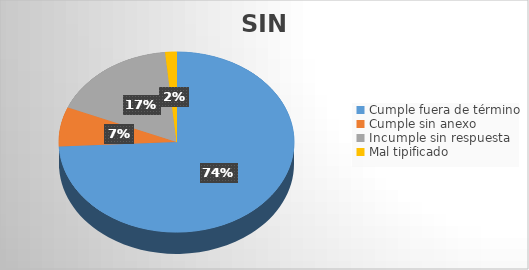
| Category | TOTAL |
|---|---|
| Cumple fuera de término | 95 |
| Cumple sin anexo | 9 |
| Incumple sin respuesta | 22 |
| Mal tipificado | 2 |